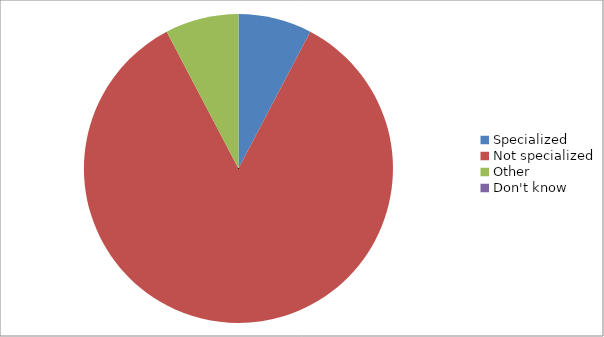
| Category | Series 0 |
|---|---|
| Specialized | 2 |
| Not specialized | 22 |
| Other | 2 |
| Don't know | 0 |